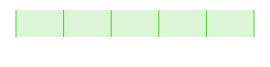
| Category | Dreiging van substituten |
|---|---|
| 0 | 0 |